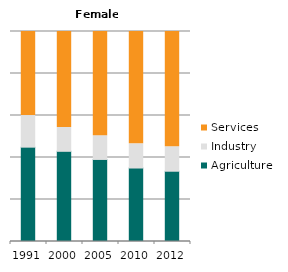
| Category | Agriculture | Industry | Services |
|---|---|---|---|
| 1991.0 | 44.925 | 15.035 | 40.04 |
| 2000.0 | 42.947 | 11.393 | 45.66 |
| 2005.0 | 39.078 | 11.305 | 49.617 |
| 2010.0 | 34.993 | 11.518 | 53.489 |
| 2012.0 | 33.465 | 11.639 | 54.896 |